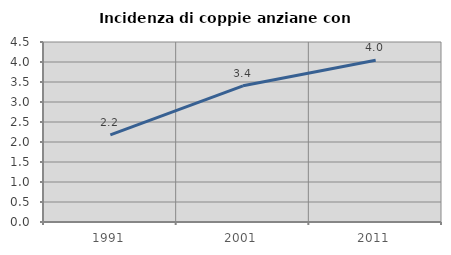
| Category | Incidenza di coppie anziane con figli |
|---|---|
| 1991.0 | 2.178 |
| 2001.0 | 3.404 |
| 2011.0 | 4.044 |